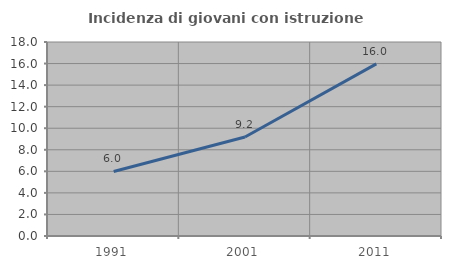
| Category | Incidenza di giovani con istruzione universitaria |
|---|---|
| 1991.0 | 5.988 |
| 2001.0 | 9.18 |
| 2011.0 | 15.966 |